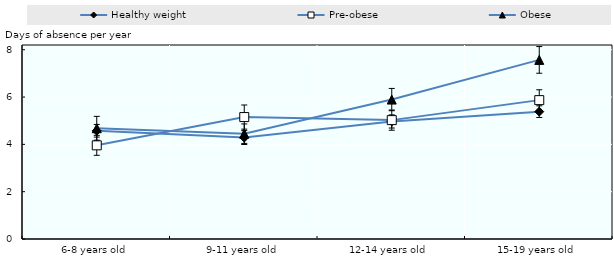
| Category | Healthy weight | Pre-obese | Obese |
|---|---|---|---|
| 6-8 years old | 4.575 | 3.959 | 4.681 |
| 9-11 years old | 4.288 | 5.154 | 4.452 |
| 12-14 years old | 4.968 | 5.025 | 5.893 |
| 15-19 years old | 5.383 | 5.87 | 7.57 |